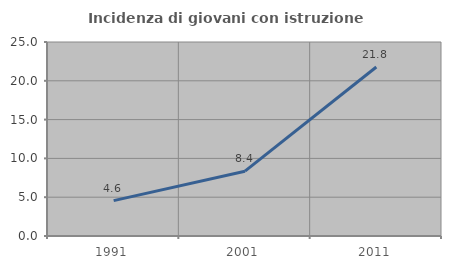
| Category | Incidenza di giovani con istruzione universitaria |
|---|---|
| 1991.0 | 4.557 |
| 2001.0 | 8.351 |
| 2011.0 | 21.78 |